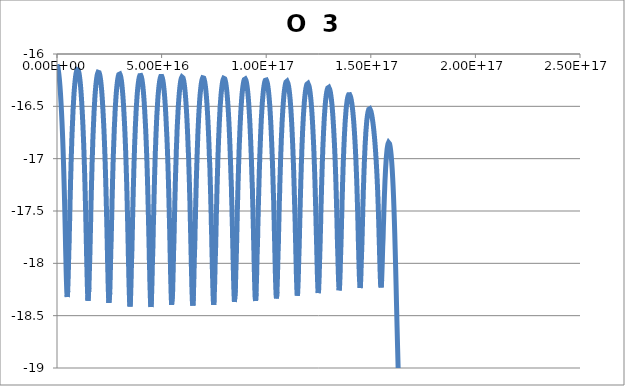
| Category | O  3 5006.84A |
|---|---|
| 474447000000.0 | -16.101 |
| 2846680000000.0 | -16.101 |
| 12335600000000.0 | -16.102 |
| 50291400000000.0 | -16.102 |
| 120130000000000.0 | -16.106 |
| 210920000000000.0 | -16.111 |
| 328947000000000.0 | -16.119 |
| 482382000000000.0 | -16.134 |
| 681848000000000.0 | -16.16 |
| 919590000000000.0 | -16.199 |
| 1169590000000000.0 | -16.248 |
| 1419590000000000.0 | -16.308 |
| 1669590000000000.0 | -16.38 |
| 1919590000000000.0 | -16.466 |
| 2160050000000000.0 | -16.555 |
| 2379430000000000.0 | -16.646 |
| 2576640000000000.0 | -16.738 |
| 2755440000000000.0 | -16.83 |
| 2920540000000000.0 | -16.923 |
| 3075020000000000.0 | -17.017 |
| 3221060000000000.0 | -17.114 |
| 3360360000000000.0 | -17.212 |
| 3494240000000000.0 | -17.313 |
| 3622150000000000.0 | -17.413 |
| 3744730000000000.0 | -17.515 |
| 3864340000000000.0 | -17.618 |
| 3982080000000000.0 | -17.722 |
| 4116760000000000.0 | -17.858 |
| 4251340000000000.0 | -17.96 |
| 4385800000000000.0 | -18.084 |
| 4530130000000000.0 | -18.182 |
| 4687330000000000.0 | -18.274 |
| 4891670000000000.0 | -18.322 |
| 5132170000000000.0 | -18.262 |
| 5382170000000000.0 | -18.108 |
| 5632170000000000.0 | -17.902 |
| 5816880000000000.0 | -17.796 |
| 5954200000000000.0 | -17.658 |
| 6089730000000000.0 | -17.556 |
| 6222920000000000.0 | -17.428 |
| 6358040000000000.0 | -17.332 |
| 6495680000000000.0 | -17.212 |
| 6639740000000000.0 | -17.116 |
| 6792160000000000.0 | -17 |
| 6954260000000000.0 | -16.907 |
| 7128960000000000.0 | -16.795 |
| 7318070000000000.0 | -16.702 |
| 7493990000000000.0 | -16.624 |
| 7690800000000000.0 | -16.531 |
| 7904960000000000.0 | -16.457 |
| 8132880000000000.0 | -16.377 |
| 8382880000000000.0 | -16.313 |
| 8632880000000000.0 | -16.259 |
| 8882880000000000.0 | -16.216 |
| 9132880000000000.0 | -16.183 |
| 9382880000000000.0 | -16.161 |
| 9632880000000000.0 | -16.148 |
| 9882880000000000.0 | -16.146 |
| 1.01329e+16 | -16.153 |
| 1.03829e+16 | -16.171 |
| 1.06329e+16 | -16.194 |
| 1.08829e+16 | -16.233 |
| 1.11329e+16 | -16.278 |
| 1.13829e+16 | -16.336 |
| 1.16329e+16 | -16.404 |
| 1.18829e+16 | -16.486 |
| 1.21258e+16 | -16.576 |
| 1.23482e+16 | -16.666 |
| 1.25461e+16 | -16.755 |
| 1.27254e+16 | -16.846 |
| 1.2891e+16 | -16.938 |
| 1.30459e+16 | -17.032 |
| 1.31921e+16 | -17.128 |
| 1.33314e+16 | -17.225 |
| 1.34652e+16 | -17.325 |
| 1.35945e+16 | -17.428 |
| 1.37178e+16 | -17.528 |
| 1.38359e+16 | -17.63 |
| 1.39522e+16 | -17.733 |
| 1.40677e+16 | -17.838 |
| 1.42005e+16 | -17.972 |
| 1.4335e+16 | -18.074 |
| 1.44717e+16 | -18.194 |
| 1.4623e+16 | -18.283 |
| 1.47934e+16 | -18.357 |
| 1.50147e+16 | -18.352 |
| 1.52647e+16 | -18.236 |
| 1.55147e+16 | -18.046 |
| 1.57081e+16 | -17.926 |
| 1.5839e+16 | -17.812 |
| 1.5962e+16 | -17.704 |
| 1.60823e+16 | -17.598 |
| 1.62196e+16 | -17.465 |
| 1.63572e+16 | -17.367 |
| 1.64949e+16 | -17.247 |
| 1.66396e+16 | -17.15 |
| 1.67932e+16 | -17.032 |
| 1.69567e+16 | -16.937 |
| 1.7133e+16 | -16.824 |
| 1.73241e+16 | -16.73 |
| 1.75021e+16 | -16.65 |
| 1.77012e+16 | -16.557 |
| 1.79193e+16 | -16.482 |
| 1.81499e+16 | -16.402 |
| 1.83921e+16 | -16.341 |
| 1.86344e+16 | -16.287 |
| 1.88844e+16 | -16.243 |
| 1.91344e+16 | -16.21 |
| 1.93844e+16 | -16.187 |
| 1.96344e+16 | -16.174 |
| 1.98844e+16 | -16.171 |
| 2.01344e+16 | -16.178 |
| 2.03844e+16 | -16.194 |
| 2.06344e+16 | -16.22 |
| 2.08844e+16 | -16.254 |
| 2.11344e+16 | -16.3 |
| 2.13844e+16 | -16.357 |
| 2.16344e+16 | -16.425 |
| 2.18844e+16 | -16.507 |
| 2.21245e+16 | -16.594 |
| 2.23438e+16 | -16.683 |
| 2.25411e+16 | -16.772 |
| 2.27197e+16 | -16.862 |
| 2.28845e+16 | -16.954 |
| 2.30385e+16 | -17.046 |
| 2.3184e+16 | -17.141 |
| 2.33224e+16 | -17.238 |
| 2.34553e+16 | -17.337 |
| 2.35837e+16 | -17.439 |
| 2.37087e+16 | -17.542 |
| 2.38285e+16 | -17.644 |
| 2.39437e+16 | -17.746 |
| 2.40584e+16 | -17.851 |
| 2.419e+16 | -17.985 |
| 2.43231e+16 | -18.087 |
| 2.44579e+16 | -18.208 |
| 2.46062e+16 | -18.298 |
| 2.47719e+16 | -18.378 |
| 2.49874e+16 | -18.386 |
| 2.52343e+16 | -18.28 |
| 2.54843e+16 | -18.092 |
| 2.57343e+16 | -17.873 |
| 2.59164e+16 | -17.769 |
| 2.60478e+16 | -17.636 |
| 2.61802e+16 | -17.535 |
| 2.63137e+16 | -17.408 |
| 2.64519e+16 | -17.31 |
| 2.65959e+16 | -17.189 |
| 2.67476e+16 | -17.092 |
| 2.69092e+16 | -16.975 |
| 2.70826e+16 | -16.88 |
| 2.72419e+16 | -16.797 |
| 2.74195e+16 | -16.7 |
| 2.76111e+16 | -16.622 |
| 2.78209e+16 | -16.528 |
| 2.80515e+16 | -16.454 |
| 2.82886e+16 | -16.384 |
| 2.85386e+16 | -16.325 |
| 2.87886e+16 | -16.278 |
| 2.90386e+16 | -16.24 |
| 2.92886e+16 | -16.212 |
| 2.95386e+16 | -16.196 |
| 2.97886e+16 | -16.189 |
| 3.00386e+16 | -16.191 |
| 3.02886e+16 | -16.203 |
| 3.05386e+16 | -16.224 |
| 3.07886e+16 | -16.255 |
| 3.10386e+16 | -16.297 |
| 3.12886e+16 | -16.349 |
| 3.15386e+16 | -16.412 |
| 3.17886e+16 | -16.487 |
| 3.20386e+16 | -16.577 |
| 3.22667e+16 | -16.662 |
| 3.24663e+16 | -16.75 |
| 3.26502e+16 | -16.838 |
| 3.28186e+16 | -16.928 |
| 3.29753e+16 | -17.019 |
| 3.31228e+16 | -17.112 |
| 3.32627e+16 | -17.207 |
| 3.33965e+16 | -17.304 |
| 3.35253e+16 | -17.403 |
| 3.36504e+16 | -17.504 |
| 3.37727e+16 | -17.608 |
| 3.38902e+16 | -17.71 |
| 3.40039e+16 | -17.812 |
| 3.41344e+16 | -17.947 |
| 3.42651e+16 | -18.049 |
| 3.4396e+16 | -18.172 |
| 3.45367e+16 | -18.266 |
| 3.46901e+16 | -18.365 |
| 3.48895e+16 | -18.412 |
| 3.51272e+16 | -18.351 |
| 3.53772e+16 | -18.194 |
| 3.56272e+16 | -17.982 |
| 3.58142e+16 | -17.87 |
| 3.59381e+16 | -17.756 |
| 3.60591e+16 | -17.652 |
| 3.61952e+16 | -17.518 |
| 3.63324e+16 | -17.418 |
| 3.64712e+16 | -17.294 |
| 3.66169e+16 | -17.196 |
| 3.67714e+16 | -17.076 |
| 3.69359e+16 | -16.98 |
| 3.71134e+16 | -16.864 |
| 3.72914e+16 | -16.784 |
| 3.74699e+16 | -16.689 |
| 3.76649e+16 | -16.609 |
| 3.78813e+16 | -16.518 |
| 3.81062e+16 | -16.453 |
| 3.83338e+16 | -16.385 |
| 3.85838e+16 | -16.329 |
| 3.88338e+16 | -16.284 |
| 3.90838e+16 | -16.247 |
| 3.93338e+16 | -16.222 |
| 3.95838e+16 | -16.207 |
| 3.98338e+16 | -16.201 |
| 4.00838e+16 | -16.205 |
| 4.03338e+16 | -16.217 |
| 4.05838e+16 | -16.241 |
| 4.08338e+16 | -16.273 |
| 4.10838e+16 | -16.316 |
| 4.13338e+16 | -16.37 |
| 4.15838e+16 | -16.434 |
| 4.18338e+16 | -16.511 |
| 4.20838e+16 | -16.604 |
| 4.23079e+16 | -16.686 |
| 4.25008e+16 | -16.773 |
| 4.26799e+16 | -16.86 |
| 4.28445e+16 | -16.949 |
| 4.2998e+16 | -17.039 |
| 4.31427e+16 | -17.131 |
| 4.32802e+16 | -17.225 |
| 4.34118e+16 | -17.32 |
| 4.35387e+16 | -17.418 |
| 4.36619e+16 | -17.519 |
| 4.37824e+16 | -17.622 |
| 4.39012e+16 | -17.727 |
| 4.40164e+16 | -17.828 |
| 4.41452e+16 | -17.961 |
| 4.42745e+16 | -18.062 |
| 4.44046e+16 | -18.184 |
| 4.45447e+16 | -18.276 |
| 4.46977e+16 | -18.372 |
| 4.48966e+16 | -18.417 |
| 4.5134e+16 | -18.353 |
| 4.5384e+16 | -18.194 |
| 4.5634e+16 | -17.981 |
| 4.58212e+16 | -17.868 |
| 4.5943e+16 | -17.759 |
| 4.60802e+16 | -17.622 |
| 4.62167e+16 | -17.52 |
| 4.63523e+16 | -17.394 |
| 4.64936e+16 | -17.294 |
| 4.66423e+16 | -17.172 |
| 4.67996e+16 | -17.074 |
| 4.69681e+16 | -16.956 |
| 4.71362e+16 | -16.874 |
| 4.73037e+16 | -16.777 |
| 4.74858e+16 | -16.695 |
| 4.76866e+16 | -16.6 |
| 4.78928e+16 | -16.533 |
| 4.81061e+16 | -16.46 |
| 4.83517e+16 | -16.39 |
| 4.86017e+16 | -16.334 |
| 4.88517e+16 | -16.29 |
| 4.91017e+16 | -16.254 |
| 4.93517e+16 | -16.23 |
| 4.96017e+16 | -16.215 |
| 4.98517e+16 | -16.21 |
| 5.01017e+16 | -16.215 |
| 5.03517e+16 | -16.228 |
| 5.06017e+16 | -16.251 |
| 5.08517e+16 | -16.284 |
| 5.11017e+16 | -16.327 |
| 5.13517e+16 | -16.381 |
| 5.16017e+16 | -16.447 |
| 5.18517e+16 | -16.523 |
| 5.21017e+16 | -16.616 |
| 5.23517e+16 | -16.722 |
| 5.25648e+16 | -16.806 |
| 5.27353e+16 | -16.892 |
| 5.28943e+16 | -16.98 |
| 5.30431e+16 | -17.07 |
| 5.31839e+16 | -17.16 |
| 5.33177e+16 | -17.253 |
| 5.34461e+16 | -17.348 |
| 5.35704e+16 | -17.445 |
| 5.36913e+16 | -17.544 |
| 5.38097e+16 | -17.645 |
| 5.39266e+16 | -17.749 |
| 5.40606e+16 | -17.886 |
| 5.41908e+16 | -17.985 |
| 5.43163e+16 | -18.108 |
| 5.44483e+16 | -18.207 |
| 5.45889e+16 | -18.313 |
| 5.47716e+16 | -18.396 |
| 5.49999e+16 | -18.4 |
| 5.52499e+16 | -18.287 |
| 5.54999e+16 | -18.098 |
| 5.57499e+16 | -17.876 |
| 5.5931e+16 | -17.774 |
| 5.606e+16 | -17.644 |
| 5.61927e+16 | -17.542 |
| 5.633e+16 | -17.412 |
| 5.64721e+16 | -17.312 |
| 5.66203e+16 | -17.19 |
| 5.67776e+16 | -17.091 |
| 5.69193e+16 | -17.005 |
| 5.70762e+16 | -16.902 |
| 5.7243e+16 | -16.82 |
| 5.74225e+16 | -16.722 |
| 5.7618e+16 | -16.641 |
| 5.7803e+16 | -16.572 |
| 5.80123e+16 | -16.491 |
| 5.82413e+16 | -16.428 |
| 5.8477e+16 | -16.368 |
| 5.8727e+16 | -16.318 |
| 5.8977e+16 | -16.278 |
| 5.9227e+16 | -16.248 |
| 5.9477e+16 | -16.229 |
| 5.9727e+16 | -16.219 |
| 5.9977e+16 | -16.219 |
| 6.0227e+16 | -16.228 |
| 6.0477e+16 | -16.246 |
| 6.0727e+16 | -16.273 |
| 6.0977e+16 | -16.311 |
| 6.1227e+16 | -16.358 |
| 6.1477e+16 | -16.418 |
| 6.1727e+16 | -16.487 |
| 6.1977e+16 | -16.572 |
| 6.2227e+16 | -16.67 |
| 6.2477e+16 | -16.783 |
| 6.2727e+16 | -16.912 |
| 6.29238e+16 | -16.994 |
| 6.30891e+16 | -17.113 |
| 6.32457e+16 | -17.198 |
| 6.33912e+16 | -17.318 |
| 6.35327e+16 | -17.41 |
| 6.36691e+16 | -17.537 |
| 6.38025e+16 | -17.633 |
| 6.39319e+16 | -17.763 |
| 6.40611e+16 | -17.864 |
| 6.419e+16 | -17.995 |
| 6.4319e+16 | -18.093 |
| 6.44481e+16 | -18.209 |
| 6.45892e+16 | -18.296 |
| 6.47458e+16 | -18.378 |
| 6.49494e+16 | -18.403 |
| 6.51895e+16 | -18.316 |
| 6.54395e+16 | -18.142 |
| 6.56895e+16 | -17.926 |
| 6.58728e+16 | -17.82 |
| 6.60069e+16 | -17.685 |
| 6.61422e+16 | -17.582 |
| 6.62793e+16 | -17.451 |
| 6.64209e+16 | -17.35 |
| 6.65682e+16 | -17.226 |
| 6.67242e+16 | -17.126 |
| 6.68639e+16 | -17.04 |
| 6.7018e+16 | -16.937 |
| 6.71815e+16 | -16.854 |
| 6.73574e+16 | -16.755 |
| 6.75406e+16 | -16.68 |
| 6.77336e+16 | -16.593 |
| 6.79383e+16 | -16.526 |
| 6.81582e+16 | -16.453 |
| 6.84074e+16 | -16.388 |
| 6.86574e+16 | -16.336 |
| 6.89074e+16 | -16.293 |
| 6.91574e+16 | -16.261 |
| 6.94074e+16 | -16.239 |
| 6.96574e+16 | -16.227 |
| 6.99074e+16 | -16.224 |
| 7.01574e+16 | -16.23 |
| 7.04074e+16 | -16.246 |
| 7.06574e+16 | -16.27 |
| 7.09074e+16 | -16.304 |
| 7.11574e+16 | -16.349 |
| 7.14074e+16 | -16.404 |
| 7.16574e+16 | -16.47 |
| 7.19074e+16 | -16.55 |
| 7.21574e+16 | -16.643 |
| 7.24074e+16 | -16.75 |
| 7.26574e+16 | -16.873 |
| 7.29074e+16 | -17.013 |
| 7.30974e+16 | -17.094 |
| 7.3247e+16 | -17.212 |
| 7.339e+16 | -17.296 |
| 7.35247e+16 | -17.413 |
| 7.36574e+16 | -17.504 |
| 7.37875e+16 | -17.629 |
| 7.3916e+16 | -17.726 |
| 7.40422e+16 | -17.853 |
| 7.41696e+16 | -17.954 |
| 7.42983e+16 | -18.08 |
| 7.44298e+16 | -18.17 |
| 7.45647e+16 | -18.279 |
| 7.47166e+16 | -18.355 |
| 7.48907e+16 | -18.397 |
| 7.51141e+16 | -18.342 |
| 7.53641e+16 | -18.191 |
| 7.56141e+16 | -17.984 |
| 7.58013e+16 | -17.873 |
| 7.59253e+16 | -17.763 |
| 7.60483e+16 | -17.655 |
| 7.61892e+16 | -17.519 |
| 7.63315e+16 | -17.416 |
| 7.64759e+16 | -17.291 |
| 7.66284e+16 | -17.19 |
| 7.6764e+16 | -17.102 |
| 7.69131e+16 | -16.998 |
| 7.70706e+16 | -16.914 |
| 7.72392e+16 | -16.814 |
| 7.74094e+16 | -16.742 |
| 7.75818e+16 | -16.658 |
| 7.77687e+16 | -16.59 |
| 7.79746e+16 | -16.509 |
| 7.8201e+16 | -16.446 |
| 7.8436e+16 | -16.386 |
| 7.8686e+16 | -16.335 |
| 7.8936e+16 | -16.294 |
| 7.9186e+16 | -16.263 |
| 7.9436e+16 | -16.243 |
| 7.9686e+16 | -16.232 |
| 7.9936e+16 | -16.23 |
| 8.0186e+16 | -16.237 |
| 8.0436e+16 | -16.253 |
| 8.0686e+16 | -16.279 |
| 8.0936e+16 | -16.314 |
| 8.1186e+16 | -16.359 |
| 8.1436e+16 | -16.414 |
| 8.1686e+16 | -16.481 |
| 8.1936e+16 | -16.561 |
| 8.2186e+16 | -16.654 |
| 8.2436e+16 | -16.762 |
| 8.2686e+16 | -16.886 |
| 8.29318e+16 | -17.022 |
| 8.31635e+16 | -17.167 |
| 8.33338e+16 | -17.25 |
| 8.34703e+16 | -17.364 |
| 8.36034e+16 | -17.453 |
| 8.37321e+16 | -17.573 |
| 8.38591e+16 | -17.666 |
| 8.39836e+16 | -17.79 |
| 8.41084e+16 | -17.886 |
| 8.42333e+16 | -18.01 |
| 8.43627e+16 | -18.108 |
| 8.44981e+16 | -18.222 |
| 8.46449e+16 | -18.304 |
| 8.48066e+16 | -18.369 |
| 8.50168e+16 | -18.362 |
| 8.52606e+16 | -18.248 |
| 8.55106e+16 | -18.061 |
| 8.57059e+16 | -17.94 |
| 8.58399e+16 | -17.826 |
| 8.59661e+16 | -17.717 |
| 8.60909e+16 | -17.608 |
| 8.62341e+16 | -17.473 |
| 8.63799e+16 | -17.37 |
| 8.65291e+16 | -17.245 |
| 8.6675e+16 | -17.159 |
| 8.68164e+16 | -17.056 |
| 8.69673e+16 | -16.97 |
| 8.71303e+16 | -16.868 |
| 8.72942e+16 | -16.797 |
| 8.74591e+16 | -16.712 |
| 8.76369e+16 | -16.642 |
| 8.78315e+16 | -16.56 |
| 8.80437e+16 | -16.496 |
| 8.82709e+16 | -16.429 |
| 8.85209e+16 | -16.371 |
| 8.87709e+16 | -16.325 |
| 8.90209e+16 | -16.288 |
| 8.92709e+16 | -16.26 |
| 8.95209e+16 | -16.244 |
| 8.97709e+16 | -16.237 |
| 9.00209e+16 | -16.238 |
| 9.02709e+16 | -16.248 |
| 9.05209e+16 | -16.268 |
| 9.07709e+16 | -16.296 |
| 9.10209e+16 | -16.333 |
| 9.12709e+16 | -16.381 |
| 9.15209e+16 | -16.439 |
| 9.17709e+16 | -16.509 |
| 9.20209e+16 | -16.592 |
| 9.22709e+16 | -16.689 |
| 9.25209e+16 | -16.801 |
| 9.27702e+16 | -16.927 |
| 9.3007e+16 | -17.059 |
| 9.32247e+16 | -17.199 |
| 9.33873e+16 | -17.28 |
| 9.35192e+16 | -17.391 |
| 9.36482e+16 | -17.477 |
| 9.37732e+16 | -17.595 |
| 9.38963e+16 | -17.685 |
| 9.4017e+16 | -17.804 |
| 9.41386e+16 | -17.899 |
| 9.42618e+16 | -18.018 |
| 9.43898e+16 | -18.113 |
| 9.45243e+16 | -18.222 |
| 9.4699e+16 | -18.322 |
| 9.49228e+16 | -18.36 |
| 9.51728e+16 | -18.28 |
| 9.54228e+16 | -18.116 |
| 9.56728e+16 | -17.907 |
| 9.58594e+16 | -17.799 |
| 9.6001e+16 | -17.659 |
| 9.61434e+16 | -17.553 |
| 9.62869e+16 | -17.421 |
| 9.6436e+16 | -17.318 |
| 9.6565e+16 | -17.229 |
| 9.67052e+16 | -17.122 |
| 9.68524e+16 | -17.037 |
| 9.70087e+16 | -16.933 |
| 9.71652e+16 | -16.861 |
| 9.73219e+16 | -16.774 |
| 9.74902e+16 | -16.704 |
| 9.76736e+16 | -16.62 |
| 9.78718e+16 | -16.554 |
| 9.80895e+16 | -16.478 |
| 9.83239e+16 | -16.422 |
| 9.85604e+16 | -16.369 |
| 9.88104e+16 | -16.325 |
| 9.90604e+16 | -16.29 |
| 9.93104e+16 | -16.266 |
| 9.95604e+16 | -16.252 |
| 9.98104e+16 | -16.245 |
| 1.0006e+17 | -16.248 |
| 1.0031e+17 | -16.26 |
| 1.0056e+17 | -16.279 |
| 1.0081e+17 | -16.309 |
| 1.0106e+17 | -16.347 |
| 1.0131e+17 | -16.395 |
| 1.0156e+17 | -16.454 |
| 1.0181e+17 | -16.524 |
| 1.0206e+17 | -16.609 |
| 1.0231e+17 | -16.706 |
| 1.0256e+17 | -16.818 |
| 1.02802e+17 | -16.938 |
| 1.03026e+17 | -17.062 |
| 1.03233e+17 | -17.192 |
| 1.0343e+17 | -17.329 |
| 1.03578e+17 | -17.411 |
| 1.037e+17 | -17.52 |
| 1.03821e+17 | -17.606 |
| 1.0394e+17 | -17.722 |
| 1.04059e+17 | -17.811 |
| 1.04177e+17 | -17.926 |
| 1.04298e+17 | -18.018 |
| 1.04424e+17 | -18.129 |
| 1.0456e+17 | -18.216 |
| 1.0471e+17 | -18.297 |
| 1.04905e+17 | -18.335 |
| 1.0514e+17 | -18.275 |
| 1.0539e+17 | -18.122 |
| 1.0564e+17 | -17.919 |
| 1.05829e+17 | -17.808 |
| 1.05977e+17 | -17.664 |
| 1.06124e+17 | -17.557 |
| 1.0627e+17 | -17.423 |
| 1.0641e+17 | -17.336 |
| 1.06541e+17 | -17.229 |
| 1.0668e+17 | -17.142 |
| 1.06808e+17 | -17.061 |
| 1.06954e+17 | -16.963 |
| 1.07105e+17 | -16.89 |
| 1.0726e+17 | -16.802 |
| 1.07426e+17 | -16.732 |
| 1.07606e+17 | -16.648 |
| 1.07793e+17 | -16.587 |
| 1.07992e+17 | -16.517 |
| 1.08215e+17 | -16.456 |
| 1.08451e+17 | -16.397 |
| 1.08701e+17 | -16.351 |
| 1.08951e+17 | -16.314 |
| 1.09201e+17 | -16.288 |
| 1.09451e+17 | -16.268 |
| 1.09701e+17 | -16.261 |
| 1.09951e+17 | -16.26 |
| 1.10201e+17 | -16.267 |
| 1.10451e+17 | -16.283 |
| 1.10701e+17 | -16.307 |
| 1.10951e+17 | -16.341 |
| 1.11201e+17 | -16.384 |
| 1.11451e+17 | -16.437 |
| 1.11701e+17 | -16.5 |
| 1.11951e+17 | -16.577 |
| 1.12201e+17 | -16.666 |
| 1.12451e+17 | -16.769 |
| 1.12691e+17 | -16.879 |
| 1.12913e+17 | -16.992 |
| 1.13117e+17 | -17.111 |
| 1.1331e+17 | -17.235 |
| 1.13493e+17 | -17.365 |
| 1.13671e+17 | -17.501 |
| 1.13808e+17 | -17.581 |
| 1.13921e+17 | -17.689 |
| 1.14036e+17 | -17.773 |
| 1.14151e+17 | -17.884 |
| 1.14268e+17 | -17.972 |
| 1.14386e+17 | -18.078 |
| 1.14513e+17 | -18.161 |
| 1.14652e+17 | -18.246 |
| 1.14832e+17 | -18.309 |
| 1.15059e+17 | -18.282 |
| 1.15309e+17 | -18.157 |
| 1.15559e+17 | -17.969 |
| 1.15755e+17 | -17.849 |
| 1.15893e+17 | -17.736 |
| 1.16027e+17 | -17.623 |
| 1.16149e+17 | -17.53 |
| 1.16279e+17 | -17.413 |
| 1.16412e+17 | -17.324 |
| 1.16548e+17 | -17.214 |
| 1.16683e+17 | -17.139 |
| 1.16815e+17 | -17.046 |
| 1.16954e+17 | -16.971 |
| 1.17103e+17 | -16.881 |
| 1.1726e+17 | -16.81 |
| 1.1743e+17 | -16.725 |
| 1.17605e+17 | -16.662 |
| 1.17788e+17 | -16.589 |
| 1.17987e+17 | -16.531 |
| 1.18206e+17 | -16.464 |
| 1.18451e+17 | -16.411 |
| 1.18697e+17 | -16.368 |
| 1.18947e+17 | -16.332 |
| 1.19197e+17 | -16.306 |
| 1.19447e+17 | -16.289 |
| 1.19697e+17 | -16.281 |
| 1.19947e+17 | -16.281 |
| 1.20197e+17 | -16.289 |
| 1.20447e+17 | -16.305 |
| 1.20697e+17 | -16.328 |
| 1.20947e+17 | -16.361 |
| 1.21197e+17 | -16.403 |
| 1.21447e+17 | -16.454 |
| 1.21697e+17 | -16.515 |
| 1.21947e+17 | -16.588 |
| 1.22197e+17 | -16.674 |
| 1.22445e+17 | -16.772 |
| 1.22676e+17 | -16.872 |
| 1.22884e+17 | -16.974 |
| 1.23078e+17 | -17.082 |
| 1.23261e+17 | -17.194 |
| 1.23436e+17 | -17.312 |
| 1.23605e+17 | -17.436 |
| 1.2377e+17 | -17.564 |
| 1.23933e+17 | -17.698 |
| 1.24061e+17 | -17.778 |
| 1.24171e+17 | -17.881 |
| 1.24284e+17 | -17.965 |
| 1.24402e+17 | -18.067 |
| 1.24529e+17 | -18.147 |
| 1.24666e+17 | -18.227 |
| 1.24844e+17 | -18.284 |
| 1.2507e+17 | -18.253 |
| 1.2532e+17 | -18.127 |
| 1.2557e+17 | -17.94 |
| 1.25768e+17 | -17.819 |
| 1.2591e+17 | -17.704 |
| 1.26036e+17 | -17.61 |
| 1.26166e+17 | -17.491 |
| 1.26298e+17 | -17.401 |
| 1.26413e+17 | -17.318 |
| 1.26543e+17 | -17.216 |
| 1.26675e+17 | -17.141 |
| 1.2681e+17 | -17.046 |
| 1.26952e+17 | -16.974 |
| 1.27103e+17 | -16.885 |
| 1.27256e+17 | -16.82 |
| 1.27415e+17 | -16.743 |
| 1.27584e+17 | -16.682 |
| 1.27767e+17 | -16.609 |
| 1.27964e+17 | -16.554 |
| 1.2818e+17 | -16.492 |
| 1.28421e+17 | -16.441 |
| 1.28666e+17 | -16.399 |
| 1.28916e+17 | -16.365 |
| 1.29166e+17 | -16.34 |
| 1.29416e+17 | -16.325 |
| 1.29666e+17 | -16.317 |
| 1.29916e+17 | -16.318 |
| 1.30166e+17 | -16.326 |
| 1.30416e+17 | -16.341 |
| 1.30666e+17 | -16.364 |
| 1.30916e+17 | -16.395 |
| 1.31166e+17 | -16.434 |
| 1.31416e+17 | -16.482 |
| 1.31666e+17 | -16.538 |
| 1.31916e+17 | -16.607 |
| 1.32166e+17 | -16.687 |
| 1.32416e+17 | -16.78 |
| 1.32643e+17 | -16.868 |
| 1.32839e+17 | -16.958 |
| 1.33021e+17 | -17.053 |
| 1.33193e+17 | -17.151 |
| 1.33357e+17 | -17.254 |
| 1.33516e+17 | -17.362 |
| 1.33671e+17 | -17.475 |
| 1.33823e+17 | -17.593 |
| 1.33997e+17 | -17.753 |
| 1.34172e+17 | -17.877 |
| 1.34296e+17 | -17.953 |
| 1.34407e+17 | -18.047 |
| 1.34528e+17 | -18.124 |
| 1.34662e+17 | -18.2 |
| 1.34835e+17 | -18.258 |
| 1.35058e+17 | -18.232 |
| 1.35308e+17 | -18.112 |
| 1.35558e+17 | -17.932 |
| 1.3576e+17 | -17.807 |
| 1.35897e+17 | -17.71 |
| 1.36033e+17 | -17.585 |
| 1.36163e+17 | -17.503 |
| 1.36285e+17 | -17.399 |
| 1.3641e+17 | -17.32 |
| 1.36537e+17 | -17.222 |
| 1.3667e+17 | -17.146 |
| 1.3681e+17 | -17.053 |
| 1.36951e+17 | -16.988 |
| 1.37092e+17 | -16.907 |
| 1.37242e+17 | -16.845 |
| 1.37402e+17 | -16.769 |
| 1.37572e+17 | -16.712 |
| 1.37755e+17 | -16.644 |
| 1.37954e+17 | -16.592 |
| 1.38172e+17 | -16.534 |
| 1.38417e+17 | -16.488 |
| 1.38663e+17 | -16.449 |
| 1.38913e+17 | -16.42 |
| 1.39163e+17 | -16.4 |
| 1.39413e+17 | -16.388 |
| 1.39663e+17 | -16.385 |
| 1.39913e+17 | -16.388 |
| 1.40163e+17 | -16.399 |
| 1.40413e+17 | -16.416 |
| 1.40663e+17 | -16.439 |
| 1.40913e+17 | -16.469 |
| 1.41163e+17 | -16.507 |
| 1.41413e+17 | -16.552 |
| 1.41663e+17 | -16.605 |
| 1.41913e+17 | -16.668 |
| 1.42163e+17 | -16.742 |
| 1.4241e+17 | -16.825 |
| 1.42636e+17 | -16.909 |
| 1.42838e+17 | -16.995 |
| 1.43024e+17 | -17.084 |
| 1.43189e+17 | -17.167 |
| 1.43337e+17 | -17.254 |
| 1.43481e+17 | -17.346 |
| 1.43622e+17 | -17.441 |
| 1.4376e+17 | -17.541 |
| 1.43897e+17 | -17.646 |
| 1.44055e+17 | -17.785 |
| 1.44215e+17 | -17.895 |
| 1.44376e+17 | -18.028 |
| 1.44552e+17 | -18.134 |
| 1.44703e+17 | -18.193 |
| 1.44854e+17 | -18.234 |
| 1.4505e+17 | -18.215 |
| 1.45286e+17 | -18.106 |
| 1.45536e+17 | -17.936 |
| 1.4573e+17 | -17.83 |
| 1.45856e+17 | -17.74 |
| 1.4597e+17 | -17.652 |
| 1.46082e+17 | -17.567 |
| 1.4621e+17 | -17.46 |
| 1.4634e+17 | -17.38 |
| 1.4647e+17 | -17.283 |
| 1.466e+17 | -17.216 |
| 1.46727e+17 | -17.133 |
| 1.46861e+17 | -17.069 |
| 1.47002e+17 | -16.99 |
| 1.47149e+17 | -16.932 |
| 1.47307e+17 | -16.86 |
| 1.47473e+17 | -16.806 |
| 1.47653e+17 | -16.743 |
| 1.47846e+17 | -16.696 |
| 1.48057e+17 | -16.641 |
| 1.48289e+17 | -16.603 |
| 1.48526e+17 | -16.569 |
| 1.48776e+17 | -16.545 |
| 1.49026e+17 | -16.529 |
| 1.49276e+17 | -16.522 |
| 1.49526e+17 | -16.523 |
| 1.49776e+17 | -16.531 |
| 1.50026e+17 | -16.544 |
| 1.50276e+17 | -16.565 |
| 1.50526e+17 | -16.59 |
| 1.50776e+17 | -16.622 |
| 1.51026e+17 | -16.657 |
| 1.51276e+17 | -16.7 |
| 1.51526e+17 | -16.746 |
| 1.51776e+17 | -16.799 |
| 1.52026e+17 | -16.859 |
| 1.52276e+17 | -16.928 |
| 1.52526e+17 | -17.008 |
| 1.52757e+17 | -17.085 |
| 1.52953e+17 | -17.159 |
| 1.53127e+17 | -17.236 |
| 1.53282e+17 | -17.308 |
| 1.53422e+17 | -17.383 |
| 1.53558e+17 | -17.463 |
| 1.53692e+17 | -17.546 |
| 1.53816e+17 | -17.624 |
| 1.53951e+17 | -17.731 |
| 1.54087e+17 | -17.815 |
| 1.54222e+17 | -17.924 |
| 1.54363e+17 | -18.013 |
| 1.54512e+17 | -18.116 |
| 1.54707e+17 | -18.207 |
| 1.54942e+17 | -18.23 |
| 1.55192e+17 | -18.158 |
| 1.55442e+17 | -18.017 |
| 1.55692e+17 | -17.843 |
| 1.55874e+17 | -17.76 |
| 1.56007e+17 | -17.656 |
| 1.56136e+17 | -17.583 |
| 1.56258e+17 | -17.494 |
| 1.56383e+17 | -17.427 |
| 1.56512e+17 | -17.346 |
| 1.56644e+17 | -17.285 |
| 1.56783e+17 | -17.212 |
| 1.56927e+17 | -17.157 |
| 1.57079e+17 | -17.092 |
| 1.5724e+17 | -17.045 |
| 1.57412e+17 | -16.99 |
| 1.57596e+17 | -16.951 |
| 1.57793e+17 | -16.908 |
| 1.58007e+17 | -16.881 |
| 1.58234e+17 | -16.857 |
| 1.58484e+17 | -16.846 |
| 1.58734e+17 | -16.846 |
| 1.58984e+17 | -16.859 |
| 1.59234e+17 | -16.882 |
| 1.59484e+17 | -16.919 |
| 1.59734e+17 | -16.966 |
| 1.59984e+17 | -17.028 |
| 1.60229e+17 | -17.1 |
| 1.60458e+17 | -17.184 |
| 1.60669e+17 | -17.27 |
| 1.60871e+17 | -17.366 |
| 1.61068e+17 | -17.472 |
| 1.6126e+17 | -17.588 |
| 1.61444e+17 | -17.711 |
| 1.61651e+17 | -17.865 |
| 1.61877e+17 | -18.04 |
| 1.62088e+17 | -18.212 |
| 1.62315e+17 | -18.408 |
| 1.62565e+17 | -18.614 |
| 1.62815e+17 | -18.81 |
| 1.63065e+17 | -18.997 |
| 1.63315e+17 | -19.17 |
| 1.63565e+17 | -19.328 |
| 1.63803e+17 | -19.46 |
| 1.64022e+17 | -19.575 |
| 1.64231e+17 | -19.673 |
| 1.64443e+17 | -19.761 |
| 1.64629e+17 | -19.813 |
| 1.64811e+17 | -19.858 |
| 1.65039e+17 | -19.879 |
| 1.65289e+17 | -19.869 |
| 1.65539e+17 | -19.841 |
| 1.65758e+17 | -19.823 |
| 1.6593e+17 | -19.807 |
| 1.66084e+17 | -19.796 |
| 1.66232e+17 | -19.787 |
| 1.66401e+17 | -19.779 |
| 1.6657e+17 | -19.796 |
| 1.66738e+17 | -19.809 |
| 1.66912e+17 | -19.849 |
| 1.67093e+17 | -19.892 |
| 1.67284e+17 | -19.964 |
| 1.67486e+17 | -20.046 |
| 1.67702e+17 | -20.164 |
| 1.67929e+17 | -20.298 |
| 1.68177e+17 | -20.474 |
| 1.68424e+17 | -20.666 |
| 1.68674e+17 | -20.876 |
| 1.68924e+17 | -21.097 |
| 1.69174e+17 | -21.329 |
| 1.69424e+17 | -21.567 |
| 1.69674e+17 | -21.811 |
| 1.69924e+17 | -22.056 |
| 1.70174e+17 | -22.301 |
| 1.70424e+17 | -22.544 |
| 1.70674e+17 | -22.782 |
| 1.70924e+17 | -23.014 |
| 1.71174e+17 | -23.239 |
| 1.71424e+17 | -23.454 |
| 1.71674e+17 | -23.66 |
| 1.71924e+17 | -23.858 |
| 1.72174e+17 | -24.045 |
| 1.72424e+17 | -24.222 |
| 1.72674e+17 | -24.391 |
| 1.72916e+17 | -24.544 |
| 1.73142e+17 | -24.681 |
| 1.73356e+17 | -24.808 |
| 1.73562e+17 | -24.93 |
| 1.73764e+17 | -35.93 |
| 1.73961e+17 | -35.93 |
| 1.74156e+17 | -35.93 |
| 1.74359e+17 | -35.93 |
| 1.7458e+17 | -35.93 |
| 1.74819e+17 | -35.93 |
| 1.75069e+17 | -35.93 |
| 1.75319e+17 | -35.93 |
| 1.75569e+17 | -35.93 |
| 1.75777e+17 | -35.93 |
| 1.75932e+17 | -35.93 |
| 1.76074e+17 | -35.93 |
| 1.76211e+17 | -35.93 |
| 1.76368e+17 | -35.93 |
| 1.76523e+17 | -35.93 |
| 1.76679e+17 | -35.93 |
| 1.76839e+17 | -35.93 |
| 1.77005e+17 | -35.93 |
| 1.7718e+17 | -35.93 |
| 1.77364e+17 | -35.93 |
| 1.7756e+17 | -35.93 |
| 1.7777e+17 | -35.93 |
| 1.77996e+17 | -35.93 |
| 1.78228e+17 | -35.93 |
| 1.78478e+17 | -35.93 |
| 1.78728e+17 | -35.93 |
| 1.78978e+17 | -35.93 |
| 1.79228e+17 | -35.93 |
| 1.79478e+17 | -35.93 |
| 1.79728e+17 | -35.93 |
| 1.79978e+17 | -35.93 |
| 1.80228e+17 | -35.93 |
| 1.80478e+17 | -35.93 |
| 1.80728e+17 | -35.93 |
| 1.80978e+17 | -35.93 |
| 1.81228e+17 | -35.93 |
| 1.81478e+17 | -35.93 |
| 1.81728e+17 | -35.93 |
| 1.81978e+17 | -35.93 |
| 1.822e+17 | -35.93 |
| 1.82389e+17 | -35.93 |
| 1.82571e+17 | -35.93 |
| 1.82744e+17 | -35.93 |
| 1.82934e+17 | -35.93 |
| 1.83167e+17 | -35.93 |
| 1.83396e+17 | -35.93 |
| 1.83594e+17 | -35.93 |
| 1.83802e+17 | -35.93 |
| 1.8401e+17 | -35.93 |
| 1.84208e+17 | -35.93 |
| 1.8442e+17 | -35.93 |
| 1.84648e+17 | -35.93 |
| 1.84894e+17 | -35.93 |
| 1.85144e+17 | -35.93 |
| 1.85394e+17 | -35.93 |
| 1.85644e+17 | -35.93 |
| 1.85836e+17 | -35.93 |
| 1.85966e+17 | -35.93 |
| 1.86092e+17 | -35.93 |
| 1.86215e+17 | -35.93 |
| 1.86357e+17 | -35.93 |
| 1.86499e+17 | -35.93 |
| 1.8664e+17 | -35.93 |
| 1.86787e+17 | -35.93 |
| 1.86939e+17 | -35.93 |
| 1.87099e+17 | -35.93 |
| 1.87267e+17 | -35.93 |
| 1.87445e+17 | -35.93 |
| 1.87634e+17 | -35.93 |
| 1.87836e+17 | -35.93 |
| 1.88052e+17 | -35.93 |
| 1.88285e+17 | -35.93 |
| 1.88521e+17 | -35.93 |
| 1.88771e+17 | -35.93 |
| 1.89021e+17 | -35.93 |
| 1.89271e+17 | -35.93 |
| 1.895e+17 | -35.93 |
| 1.89729e+17 | -35.93 |
| 1.89979e+17 | -35.93 |
| 1.90229e+17 | -35.93 |
| 1.90479e+17 | -35.93 |
| 1.90729e+17 | -35.93 |
| 1.90979e+17 | -35.93 |
| 1.91229e+17 | -35.93 |
| 1.91479e+17 | -35.93 |
| 1.91729e+17 | -35.93 |
| 1.91968e+17 | -35.93 |
| 1.92184e+17 | -35.93 |
| 1.92352e+17 | -35.93 |
| 1.92461e+17 | -35.93 |
| 1.92538e+17 | -35.93 |
| 1.92603e+17 | -35.93 |
| 1.92662e+17 | -35.93 |
| 1.92727e+17 | -35.93 |
| 1.92811e+17 | -35.93 |
| 1.9292e+17 | -35.93 |
| 1.93062e+17 | -35.93 |
| 1.93213e+17 | -35.93 |
| 1.93328e+17 | -35.93 |
| 1.93429e+17 | -35.93 |
| 1.93539e+17 | -35.93 |
| 1.93658e+17 | -35.93 |
| 1.93813e+17 | -35.93 |
| 1.94012e+17 | -35.93 |
| 1.94229e+17 | -35.93 |
| 1.94442e+17 | -35.93 |
| 1.94674e+17 | -35.93 |
| 1.94924e+17 | -35.93 |
| 1.95174e+17 | -35.93 |
| 1.95424e+17 | -35.93 |
| 1.95674e+17 | -35.93 |
| 1.95854e+17 | -35.93 |
| 1.95982e+17 | -35.93 |
| 1.9611e+17 | -35.93 |
| 1.96237e+17 | -35.93 |
| 1.96368e+17 | -35.93 |
| 1.96502e+17 | -35.93 |
| 1.96642e+17 | -35.93 |
| 1.96791e+17 | -35.93 |
| 1.9695e+17 | -35.93 |
| 1.97122e+17 | -35.93 |
| 1.9731e+17 | -35.93 |
| 1.97449e+17 | -35.93 |
| 1.97562e+17 | -35.93 |
| 1.97709e+17 | -35.93 |
| 1.97864e+17 | -35.93 |
| 1.98028e+17 | -35.93 |
| 1.98211e+17 | -35.93 |
| 1.9838e+17 | -35.93 |
| 1.98489e+17 | -35.93 |
| 1.98535e+17 | -35.93 |
| 1.98575e+17 | -35.93 |
| 1.98627e+17 | -35.93 |
| 1.98695e+17 | -35.93 |
| 1.98783e+17 | -35.93 |
| 1.98898e+17 | -35.93 |
| 1.99021e+17 | -35.93 |
| 1.99132e+17 | -35.93 |
| 1.99231e+17 | -35.93 |
| 1.99314e+17 | -35.93 |
| 1.99385e+17 | -35.93 |
| 1.99454e+17 | -35.93 |
| 1.99514e+17 | -35.93 |
| 1.99556e+17 | -35.93 |
| 1.99585e+17 | -35.93 |
| 1.99607e+17 | -35.93 |
| 1.99628e+17 | -35.93 |
| 1.99649e+17 | -35.93 |
| 1.99667e+17 | -35.93 |
| 1.99684e+17 | -35.93 |
| 1.99698e+17 | -35.93 |
| 1.99712e+17 | -35.93 |
| 1.99725e+17 | -35.93 |
| 1.99735e+17 | -35.93 |
| 1.99742e+17 | -35.93 |
| 1.99749e+17 | -35.93 |
| 1.99757e+17 | -35.93 |
| 1.99765e+17 | -35.93 |
| 1.99773e+17 | -35.93 |
| 1.99781e+17 | -35.93 |
| 1.99788e+17 | -35.93 |
| 1.99796e+17 | -35.93 |
| 1.99803e+17 | -35.93 |
| 1.9981e+17 | -35.93 |
| 1.99817e+17 | -35.93 |
| 1.99824e+17 | -35.93 |
| 1.99831e+17 | -35.93 |
| 1.99838e+17 | -35.93 |
| 1.99845e+17 | -35.93 |
| 1.99851e+17 | -35.93 |
| 1.99858e+17 | -35.93 |
| 1.99864e+17 | -35.93 |
| 1.99871e+17 | -35.93 |
| 1.99877e+17 | -35.93 |
| 1.99884e+17 | -35.93 |
| 1.9989e+17 | -35.93 |
| 1.99896e+17 | -35.93 |
| 1.99902e+17 | -35.93 |
| 1.99907e+17 | -35.93 |
| 1.99913e+17 | -35.93 |
| 1.99919e+17 | -35.93 |
| 1.99924e+17 | -35.93 |